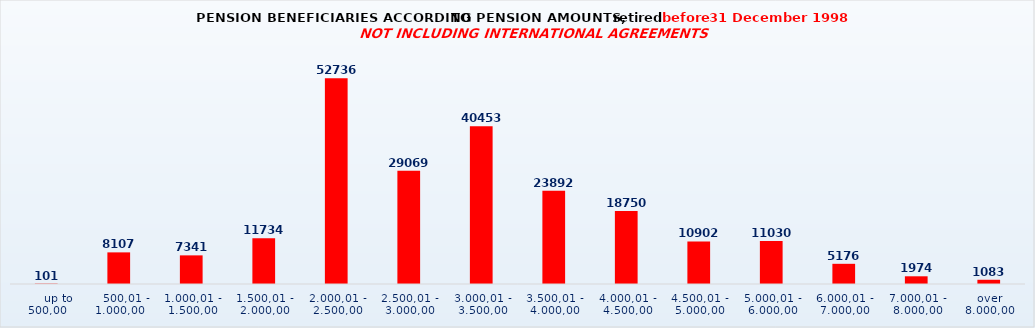
| Category | Series 0 |
|---|---|
|      up to 500,00 | 101 |
|    500,01 - 1.000,00 | 8107 |
| 1.000,01 - 1.500,00 | 7341 |
| 1.500,01 - 2.000,00 | 11734 |
| 2.000,01 - 2.500,00 | 52736 |
| 2.500,01 - 3.000,00 | 29069 |
| 3.000,01 - 3.500,00 | 40453 |
| 3.500,01 - 4.000,00 | 23892 |
| 4.000,01 - 4.500,00 | 18750 |
| 4.500,01 - 5.000,00 | 10902 |
| 5.000,01 - 6.000,00 | 11030 |
| 6.000,01 - 7.000,00 | 5176 |
| 7.000,01 - 8.000,00 | 1974 |
| over 8.000,00 | 1083 |